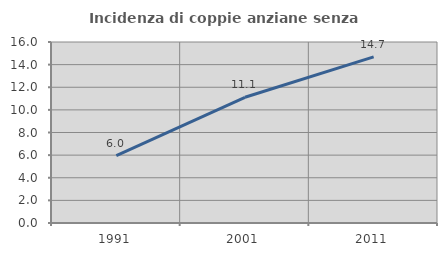
| Category | Incidenza di coppie anziane senza figli  |
|---|---|
| 1991.0 | 5.966 |
| 2001.0 | 11.111 |
| 2011.0 | 14.688 |